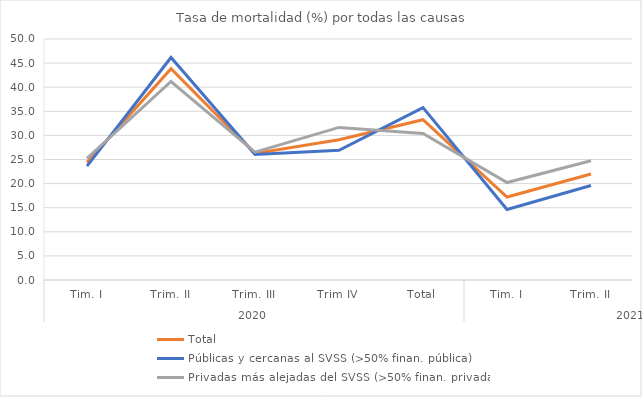
| Category | Total | Públicas y cercanas al SVSS (>50% finan. pública) | Privadas más alejadas del SVSS (>50% finan. privada) |
|---|---|---|---|
| 0 | 24.387 | 23.637 | 25.249 |
| 1 | 43.85 | 46.17 | 41.185 |
| 2 | 26.257 | 26.027 | 26.52 |
| 3 | 29.109 | 26.898 | 31.655 |
| 4 | 33.252 | 35.771 | 30.385 |
| 5 | 17.215 | 14.616 | 20.22 |
| 6 | 21.996 | 19.617 | 24.727 |